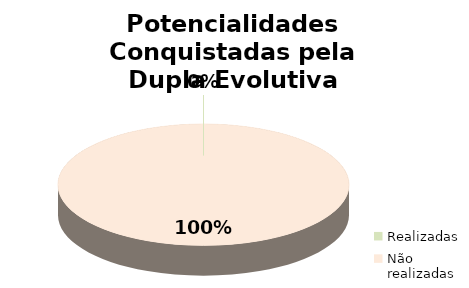
| Category | Series 0 |
|---|---|
| Realizadas | 0 |
| Não realizadas | 30 |